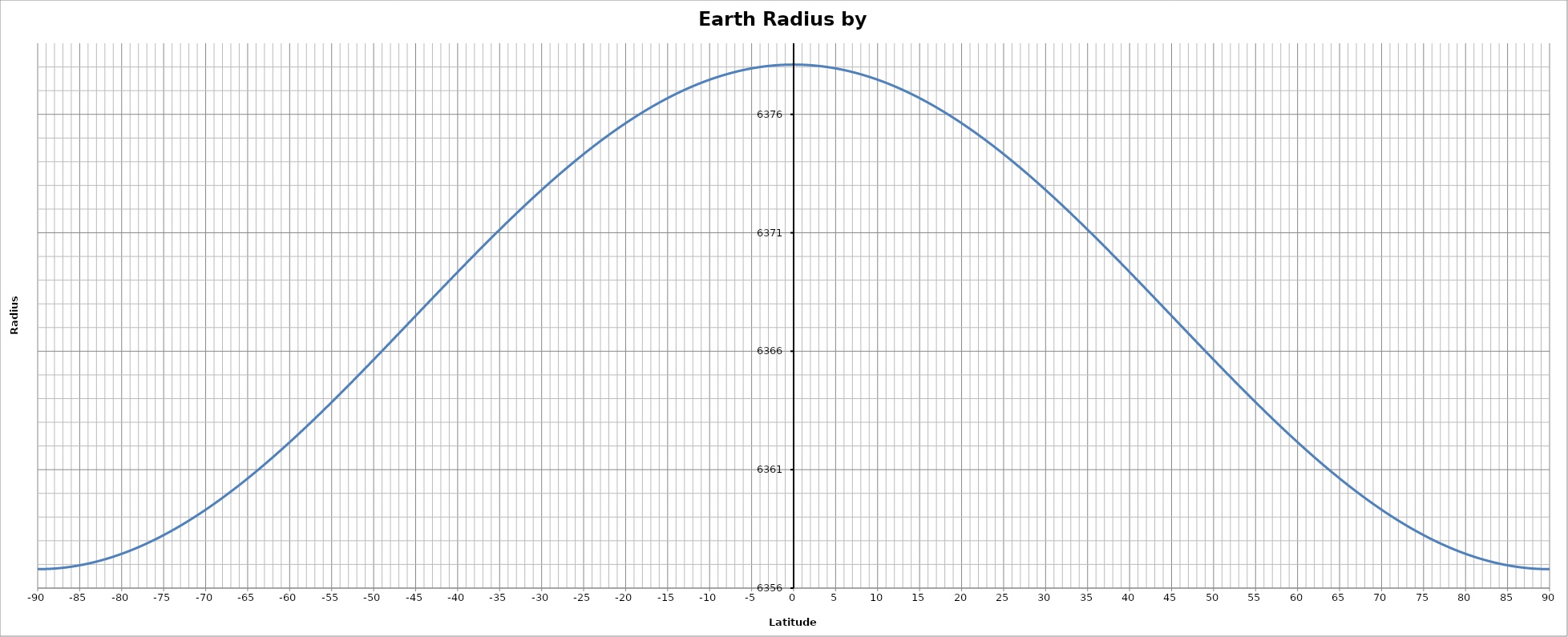
| Category | Earth Radius by Latitude |
|---|---|
| -90.0 | 6356.8 |
| -89.0 | 6356.807 |
| -88.0 | 6356.826 |
| -87.0 | 6356.859 |
| -86.0 | 6356.905 |
| -85.0 | 6356.963 |
| -84.0 | 6357.035 |
| -83.0 | 6357.119 |
| -82.0 | 6357.216 |
| -81.0 | 6357.326 |
| -80.0 | 6357.448 |
| -79.0 | 6357.582 |
| -78.0 | 6357.728 |
| -77.0 | 6357.886 |
| -76.0 | 6358.056 |
| -75.0 | 6358.238 |
| -74.0 | 6358.431 |
| -73.0 | 6358.635 |
| -72.0 | 6358.849 |
| -71.0 | 6359.075 |
| -70.0 | 6359.31 |
| -69.0 | 6359.556 |
| -68.0 | 6359.811 |
| -67.0 | 6360.075 |
| -66.0 | 6360.348 |
| -65.0 | 6360.631 |
| -64.0 | 6360.921 |
| -63.0 | 6361.219 |
| -62.0 | 6361.525 |
| -61.0 | 6361.838 |
| -60.0 | 6362.158 |
| -59.0 | 6362.485 |
| -58.0 | 6362.817 |
| -57.0 | 6363.155 |
| -56.0 | 6363.499 |
| -55.0 | 6363.847 |
| -54.0 | 6364.199 |
| -53.0 | 6364.556 |
| -52.0 | 6364.916 |
| -51.0 | 6365.278 |
| -50.0 | 6365.644 |
| -49.0 | 6366.012 |
| -48.0 | 6366.381 |
| -47.0 | 6366.751 |
| -46.0 | 6367.123 |
| -45.0 | 6367.495 |
| -44.0 | 6367.866 |
| -43.0 | 6368.237 |
| -42.0 | 6368.607 |
| -41.0 | 6368.976 |
| -40.0 | 6369.343 |
| -39.0 | 6369.707 |
| -38.0 | 6370.068 |
| -37.0 | 6370.427 |
| -36.0 | 6370.781 |
| -35.0 | 6371.132 |
| -34.0 | 6371.478 |
| -33.0 | 6371.819 |
| -32.0 | 6372.155 |
| -31.0 | 6372.485 |
| -30.0 | 6372.808 |
| -29.0 | 6373.126 |
| -28.0 | 6373.436 |
| -27.0 | 6373.739 |
| -26.0 | 6374.034 |
| -25.0 | 6374.322 |
| -24.0 | 6374.601 |
| -23.0 | 6374.871 |
| -22.0 | 6375.132 |
| -21.0 | 6375.384 |
| -20.0 | 6375.627 |
| -19.0 | 6375.859 |
| -18.0 | 6376.081 |
| -17.0 | 6376.293 |
| -16.0 | 6376.494 |
| -15.0 | 6376.684 |
| -14.0 | 6376.863 |
| -13.0 | 6377.031 |
| -12.0 | 6377.187 |
| -11.0 | 6377.331 |
| -10.0 | 6377.463 |
| -9.0 | 6377.583 |
| -8.0 | 6377.691 |
| -7.0 | 6377.786 |
| -6.0 | 6377.869 |
| -5.0 | 6377.94 |
| -4.0 | 6377.997 |
| -3.0 | 6378.042 |
| -2.0 | 6378.074 |
| -1.0 | 6378.094 |
| 0.0 | 6378.1 |
| 1.0 | 6378.094 |
| 2.0 | 6378.074 |
| 3.0 | 6378.042 |
| 4.0 | 6377.997 |
| 5.0 | 6377.94 |
| 6.0 | 6377.869 |
| 7.0 | 6377.786 |
| 8.0 | 6377.691 |
| 9.0 | 6377.583 |
| 10.0 | 6377.463 |
| 11.0 | 6377.331 |
| 12.0 | 6377.187 |
| 13.0 | 6377.031 |
| 14.0 | 6376.863 |
| 15.0 | 6376.684 |
| 16.0 | 6376.494 |
| 17.0 | 6376.293 |
| 18.0 | 6376.081 |
| 19.0 | 6375.859 |
| 20.0 | 6375.627 |
| 21.0 | 6375.384 |
| 22.0 | 6375.132 |
| 23.0 | 6374.871 |
| 24.0 | 6374.601 |
| 25.0 | 6374.322 |
| 26.0 | 6374.034 |
| 27.0 | 6373.739 |
| 28.0 | 6373.436 |
| 29.0 | 6373.126 |
| 30.0 | 6372.808 |
| 31.0 | 6372.485 |
| 32.0 | 6372.155 |
| 33.0 | 6371.819 |
| 34.0 | 6371.478 |
| 35.0 | 6371.132 |
| 36.0 | 6370.781 |
| 37.0 | 6370.427 |
| 38.0 | 6370.068 |
| 39.0 | 6369.707 |
| 40.0 | 6369.343 |
| 41.0 | 6368.976 |
| 42.0 | 6368.607 |
| 43.0 | 6368.237 |
| 44.0 | 6367.866 |
| 45.0 | 6367.495 |
| 46.0 | 6367.123 |
| 47.0 | 6366.751 |
| 48.0 | 6366.381 |
| 49.0 | 6366.012 |
| 50.0 | 6365.644 |
| 51.0 | 6365.278 |
| 52.0 | 6364.916 |
| 53.0 | 6364.556 |
| 54.0 | 6364.199 |
| 55.0 | 6363.847 |
| 56.0 | 6363.499 |
| 57.0 | 6363.155 |
| 58.0 | 6362.817 |
| 59.0 | 6362.485 |
| 60.0 | 6362.158 |
| 61.0 | 6361.838 |
| 62.0 | 6361.525 |
| 63.0 | 6361.219 |
| 64.0 | 6360.921 |
| 65.0 | 6360.631 |
| 66.0 | 6360.348 |
| 67.0 | 6360.075 |
| 68.0 | 6359.811 |
| 69.0 | 6359.556 |
| 70.0 | 6359.31 |
| 71.0 | 6359.075 |
| 72.0 | 6358.849 |
| 73.0 | 6358.635 |
| 74.0 | 6358.431 |
| 75.0 | 6358.238 |
| 76.0 | 6358.056 |
| 77.0 | 6357.886 |
| 78.0 | 6357.728 |
| 79.0 | 6357.582 |
| 80.0 | 6357.448 |
| 81.0 | 6357.326 |
| 82.0 | 6357.216 |
| 83.0 | 6357.119 |
| 84.0 | 6357.035 |
| 85.0 | 6356.963 |
| 86.0 | 6356.905 |
| 87.0 | 6356.859 |
| 88.0 | 6356.826 |
| 89.0 | 6356.807 |
| 90.0 | 6356.8 |